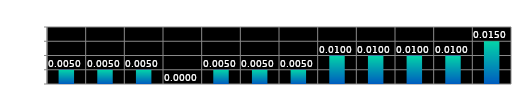
| Category | Series 0 |
|---|---|
| 0 | 0.005 |
| 1 | 0.005 |
| 2 | 0.005 |
| 3 | 0 |
| 4 | 0.005 |
| 5 | 0.005 |
| 6 | 0.005 |
| 7 | 0.01 |
| 8 | 0.01 |
| 9 | 0.01 |
| 10 | 0.01 |
| 11 | 0.015 |